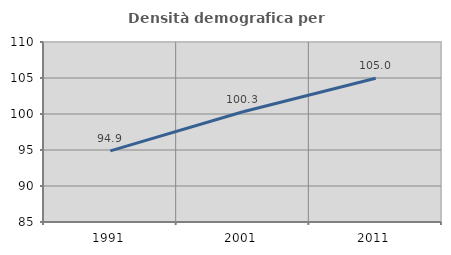
| Category | Densità demografica |
|---|---|
| 1991.0 | 94.871 |
| 2001.0 | 100.312 |
| 2011.0 | 104.975 |